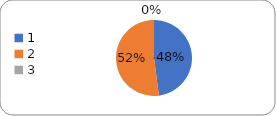
| Category | Series 0 |
|---|---|
| 0 | 58 |
| 1 | 63 |
| 2 | 0 |